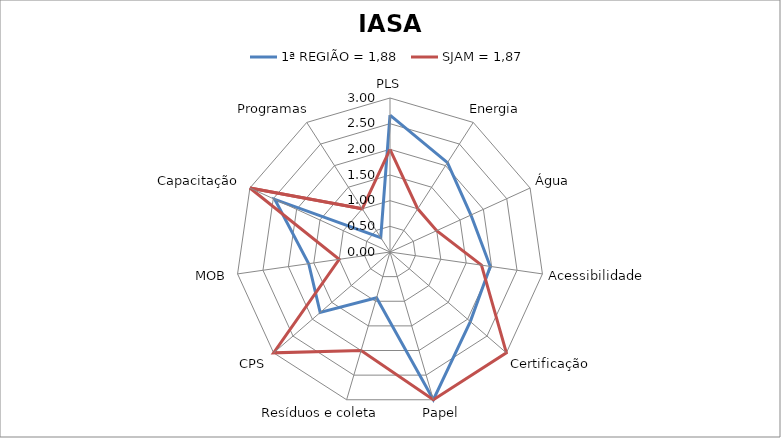
| Category | 1ª REGIÃO = 1,88 | SJAM = 1,87 |
|---|---|---|
| PLS | 2.667 | 2 |
| Energia | 2.07 | 1 |
| Água | 1.733 | 1 |
| Acessibilidade | 1.973 | 1.8 |
| Certificação | 2.07 | 3 |
| Papel | 3 | 3 |
| Resíduos e coleta | 0.93 | 2 |
| CPS | 1.8 | 3 |
| MOB | 1.6 | 1 |
| Capacitação | 2.467 | 3 |
| Programas | 0.333 | 1 |